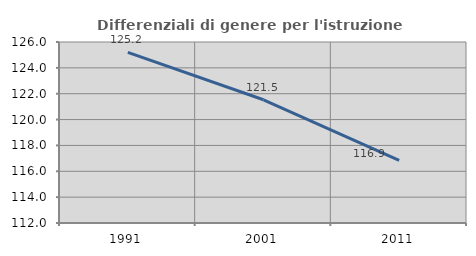
| Category | Differenziali di genere per l'istruzione superiore |
|---|---|
| 1991.0 | 125.194 |
| 2001.0 | 121.53 |
| 2011.0 | 116.853 |